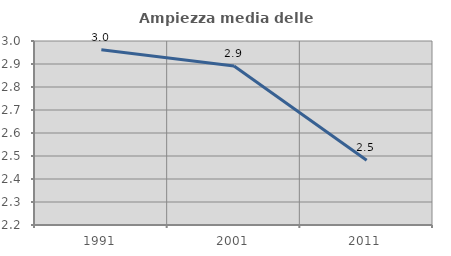
| Category | Ampiezza media delle famiglie |
|---|---|
| 1991.0 | 2.962 |
| 2001.0 | 2.892 |
| 2011.0 | 2.481 |